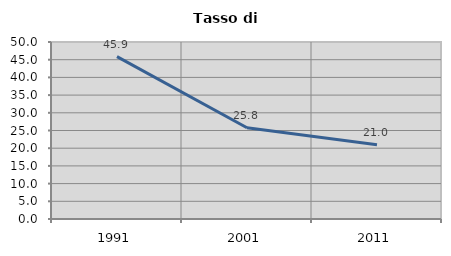
| Category | Tasso di disoccupazione   |
|---|---|
| 1991.0 | 45.882 |
| 2001.0 | 25.779 |
| 2011.0 | 20.979 |